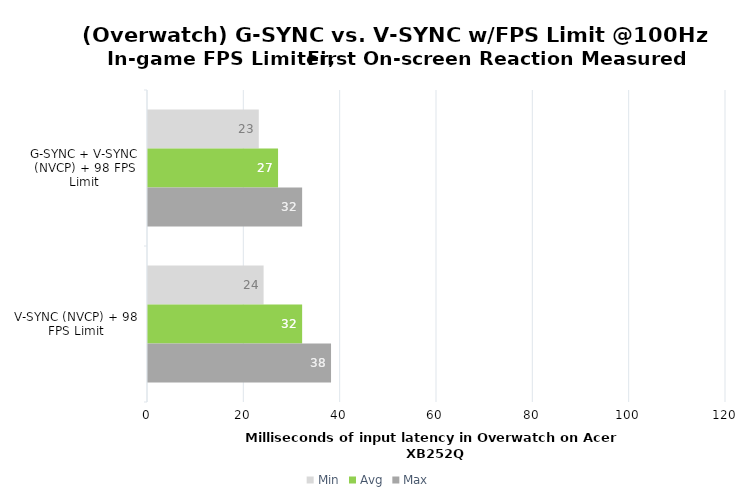
| Category | Min | Avg | Max |
|---|---|---|---|
| G-SYNC + V-SYNC (NVCP) + 98 FPS Limit | 23 | 27 | 32 |
| V-SYNC (NVCP) + 98 FPS Limit | 24 | 32 | 38 |